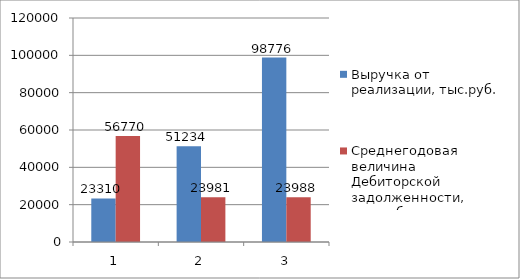
| Category | Выручка от реализации, тыс.руб. | Среднегодовая величина Дебиторской задолженности, тыс.руб. |
|---|---|---|
| 0 | 23310 | 56770 |
| 1 | 51234 | 23981 |
| 2 | 98776 | 23988 |